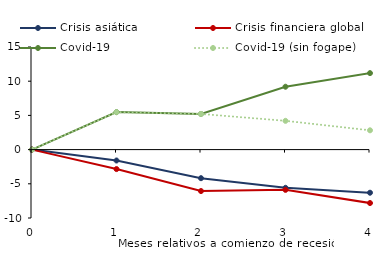
| Category | Crisis asiática | Crisis financiera global  | Covid-19 | Covid-19 (sin fogape)  |
|---|---|---|---|---|
| 0.0 | 0 | 0 | 0 | 0 |
| 1.0 | -1.593 | -2.847 | 5.479 | 5.479 |
| 2.0 | -4.181 | -6.061 | 5.215 | 5.215 |
| 3.0 | -5.586 | -5.885 | 9.191 | 4.207 |
| 4.0 | -6.305 | -7.813 | 11.181 | 2.82 |